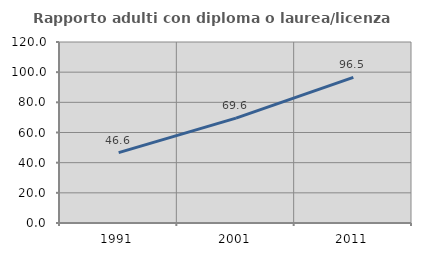
| Category | Rapporto adulti con diploma o laurea/licenza media  |
|---|---|
| 1991.0 | 46.621 |
| 2001.0 | 69.569 |
| 2011.0 | 96.501 |